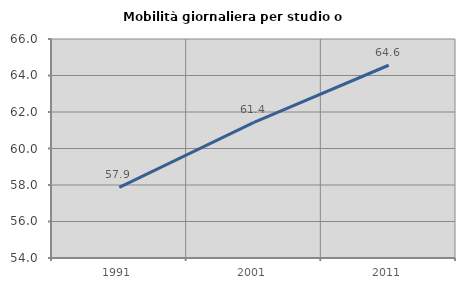
| Category | Mobilità giornaliera per studio o lavoro |
|---|---|
| 1991.0 | 57.872 |
| 2001.0 | 61.429 |
| 2011.0 | 64.562 |